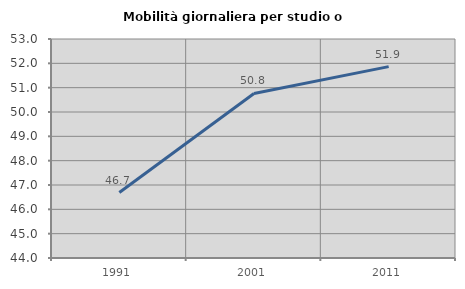
| Category | Mobilità giornaliera per studio o lavoro |
|---|---|
| 1991.0 | 46.691 |
| 2001.0 | 50.763 |
| 2011.0 | 51.866 |